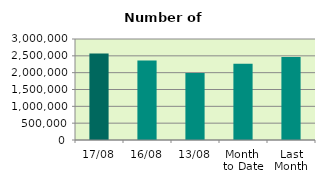
| Category | Series 0 |
|---|---|
| 17/08 | 2568864 |
| 16/08 | 2359142 |
| 13/08 | 1988106 |
| Month 
to Date | 2263261.5 |
| Last
Month | 2465054.636 |